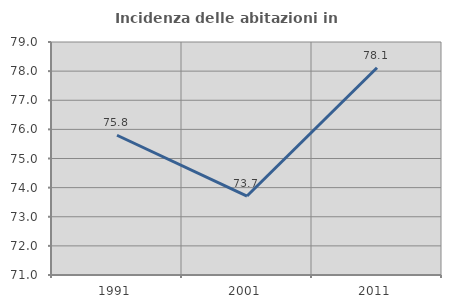
| Category | Incidenza delle abitazioni in proprietà  |
|---|---|
| 1991.0 | 75.798 |
| 2001.0 | 73.711 |
| 2011.0 | 78.118 |